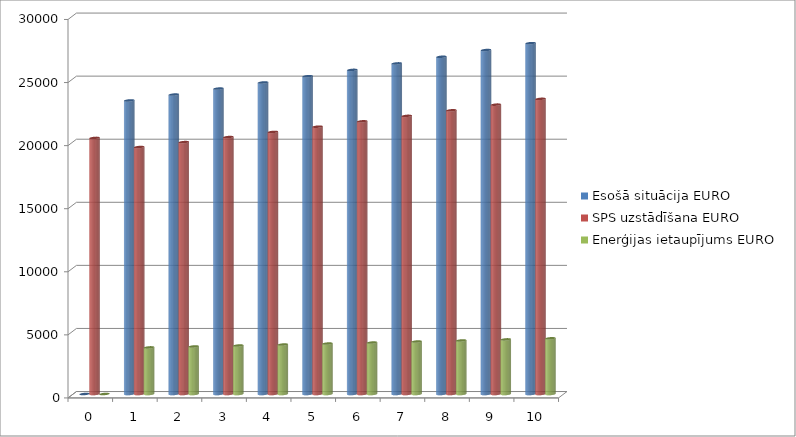
| Category | Esošā situācija EURO | SPS uzstādīšana EURO | Enerģijas ietaupījums EURO |
|---|---|---|---|
| 0.0 | 0 | 20300 | 0 |
| 1.0 | 23270 | 19576 | 3694 |
| 2.0 | 23735.4 | 19967.52 | 3767.88 |
| 3.0 | 24210.108 | 20366.87 | 3843.238 |
| 4.0 | 24694.31 | 20774.208 | 3920.102 |
| 5.0 | 25188.196 | 21189.692 | 3998.504 |
| 6.0 | 25691.96 | 21613.486 | 4078.474 |
| 7.0 | 26205.799 | 22045.756 | 4160.044 |
| 8.0 | 26729.915 | 22486.671 | 4243.245 |
| 9.0 | 27264.514 | 22936.404 | 4328.11 |
| 10.0 | 27809.804 | 23395.132 | 4414.672 |